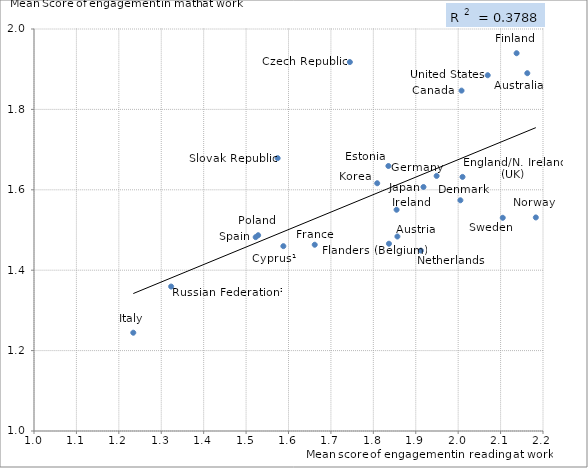
| Category | Series 1 |
|---|---|
| 2.162981491584741 | 1.89 |
| 1.8567223166507096 | 1.484 |
| 2.0079539994263147 | 1.847 |
| 1.5878677527338478 | 1.46 |
| 1.7446370377196088 | 1.918 |
| 2.0052352760753016 | 1.574 |
| 2.0102533912787255 | 1.632 |
| 1.8355057593126958 | 1.659 |
| 2.137753371977311 | 1.94 |
| 1.8367894769030544 | 1.466 |
| 1.6618311278048445 | 1.463 |
| 1.949234467672719 | 1.635 |
| 1.8548075707715308 | 1.55 |
| 1.2340738393928647 | 1.244 |
| 1.9182466323095348 | 1.607 |
| 1.8091253718602471 | 1.616 |
| 1.9120879235587362 | 1.449 |
| 2.18305952592227 | 1.531 |
| 1.5284821920769442 | 1.487 |
| 1.3232898093304097 | 1.359 |
| 1.5744292909056845 | 1.679 |
| 1.522646270850944 | 1.482 |
| 2.1051072306636645 | 1.53 |
| 2.0696827178466206 | 1.885 |